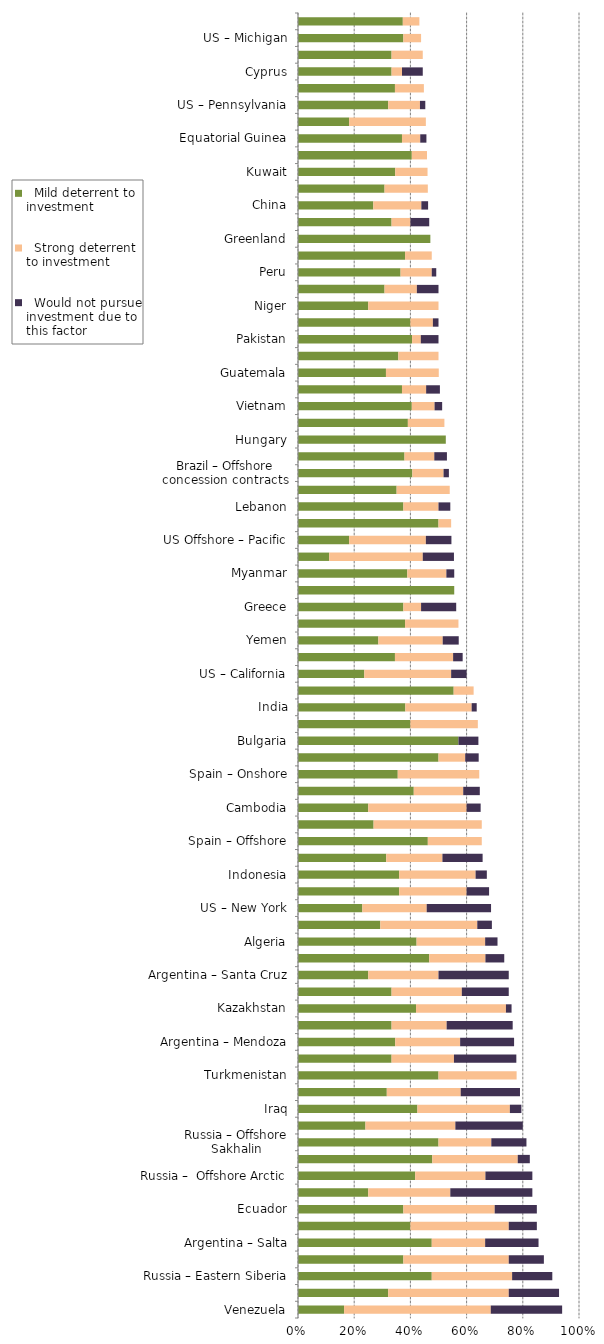
| Category |   Mild deterrent to investment |   Strong deterrent to investment |   Would not pursue investment due to this factor |
|---|---|---|---|
| Venezuela | 0.164 | 0.522 | 0.254 |
| Bolivia | 0.321 | 0.429 | 0.179 |
| Russia – Eastern Siberia | 0.476 | 0.286 | 0.143 |
| Kyrgyzstan | 0.375 | 0.375 | 0.125 |
| Argentina – Salta | 0.476 | 0.19 | 0.19 |
| Russia – other | 0.4 | 0.35 | 0.1 |
| Ecuador | 0.375 | 0.325 | 0.15 |
| CA – Quebec | 0.25 | 0.292 | 0.292 |
| Russia –  Offshore Arctic | 0.417 | 0.25 | 0.167 |
| Ukraine | 0.478 | 0.304 | 0.043 |
| Russia – Offshore Sakhalin | 0.5 | 0.188 | 0.125 |
| Iran | 0.24 | 0.32 | 0.24 |
| Iraq | 0.425 | 0.329 | 0.041 |
| Argentina – Chubut | 0.316 | 0.263 | 0.211 |
| Turkmenistan | 0.5 | 0.278 | 0 |
| Argentina – Tierra del Fuego | 0.333 | 0.222 | 0.222 |
| Argentina – Mendoza | 0.346 | 0.231 | 0.192 |
| Argentina – Neuquen | 0.333 | 0.196 | 0.235 |
| Kazakhstan | 0.42 | 0.32 | 0.02 |
| Uzbekistan | 0.333 | 0.25 | 0.167 |
| Argentina – Santa Cruz | 0.25 | 0.25 | 0.25 |
| South Sudan | 0.467 | 0.2 | 0.067 |
| Algeria | 0.422 | 0.244 | 0.044 |
| Libya | 0.293 | 0.345 | 0.052 |
| US – New York | 0.229 | 0.229 | 0.229 |
| Syria | 0.36 | 0.24 | 0.08 |
| Indonesia | 0.36 | 0.272 | 0.04 |
| France | 0.314 | 0.2 | 0.143 |
| Spain – Offshore | 0.462 | 0.192 | 0 |
| Nigeria | 0.269 | 0.385 | 0 |
| Cambodia | 0.25 | 0.35 | 0.05 |
| Democratic Republic of the Congo (Kinshasa) | 0.412 | 0.176 | 0.059 |
| Spain – Onshore | 0.355 | 0.29 | 0 |
| Brazil – Offshore presalt area profit sharing contracts | 0.5 | 0.095 | 0.048 |
| Bulgaria | 0.571 | 0 | 0.071 |
| Bangladesh | 0.4 | 0.24 | 0 |
| India | 0.382 | 0.236 | 0.018 |
| Papua New Guinea | 0.554 | 0.071 | 0 |
| US – California | 0.236 | 0.309 | 0.055 |
| Timor Gap (JPDA) | 0.345 | 0.207 | 0.034 |
| Yemen | 0.286 | 0.229 | 0.057 |
| Chad | 0.381 | 0.19 | 0 |
| Greece | 0.375 | 0.063 | 0.125 |
| Malta | 0.556 | 0 | 0 |
| Myanmar | 0.389 | 0.139 | 0.028 |
| Somaliland | 0.111 | 0.333 | 0.111 |
| US Offshore – Pacific | 0.182 | 0.273 | 0.091 |
| Republic of the Congo (Brazzaville) | 0.5 | 0.045 | 0 |
| Lebanon | 0.375 | 0.125 | 0.042 |
| Italy | 0.351 | 0.189 | 0 |
| Brazil – Offshore concession contracts | 0.407 | 0.111 | 0.019 |
| Egypt | 0.379 | 0.106 | 0.045 |
| Hungary | 0.526 | 0 | 0 |
| Madagascar | 0.391 | 0.13 | 0 |
| Vietnam | 0.405 | 0.081 | 0.027 |
| US – Colorado | 0.37 | 0.086 | 0.049 |
| Guatemala | 0.313 | 0.188 | 0 |
| Albania | 0.357 | 0.143 | 0 |
| Pakistan | 0.406 | 0.031 | 0.063 |
| Angola | 0.4 | 0.08 | 0.02 |
| Niger | 0.25 | 0.25 | 0 |
| Israel | 0.308 | 0.115 | 0.077 |
| Peru | 0.365 | 0.111 | 0.016 |
| Uganda | 0.381 | 0.095 | 0 |
| Greenland | 0.471 | 0 | 0 |
| French Guiana | 0.333 | 0.067 | 0.067 |
| China | 0.268 | 0.171 | 0.024 |
| Jordan | 0.308 | 0.154 | 0 |
| Kuwait | 0.346 | 0.115 | 0 |
| Romania | 0.405 | 0.054 | 0 |
| Equatorial Guinea | 0.37 | 0.065 | 0.022 |
| AU – New South Wales | 0.182 | 0.273 | 0 |
| US – Pennsylvania | 0.321 | 0.113 | 0.019 |
| Azerbaijan | 0.345 | 0.103 | 0 |
| Cyprus | 0.333 | 0.037 | 0.074 |
| Ethiopia | 0.333 | 0.111 | 0 |
| US – Michigan | 0.375 | 0.063 | 0 |
| Ghana | 0.373 | 0.059 | 0 |